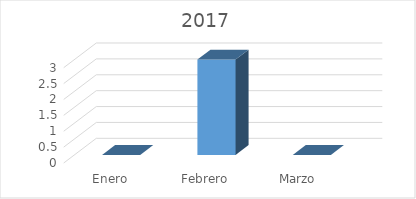
| Category | Series 0 |
|---|---|
| Enero | 0 |
| Febrero | 3 |
| Marzo  | 0 |